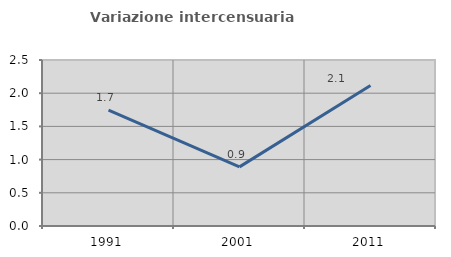
| Category | Variazione intercensuaria annua |
|---|---|
| 1991.0 | 1.744 |
| 2001.0 | 0.891 |
| 2011.0 | 2.115 |